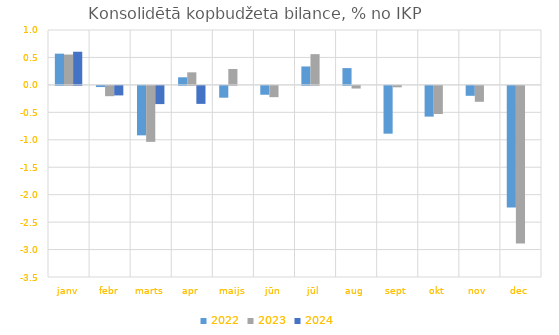
| Category | 2022 | 2023 | 2024 |
|---|---|---|---|
| janv | 0.569 | 0.553 | 0.604 |
| febr | -0.021 | -0.188 | -0.173 |
| marts | -0.901 | -1.02 | -0.332 |
| apr | 0.138 | 0.229 | -0.328 |
| maijs | -0.215 | 0.29 | 0 |
| jūn | -0.161 | -0.206 | 0 |
| jūl | 0.336 | 0.56 | 0 |
| aug | 0.306 | -0.048 | 0 |
| sept | -0.871 | -0.026 | 0 |
| okt | -0.56 | -0.512 | 0 |
| nov | -0.181 | -0.29 | 0 |
| dec | -2.218 | -2.869 | 0 |